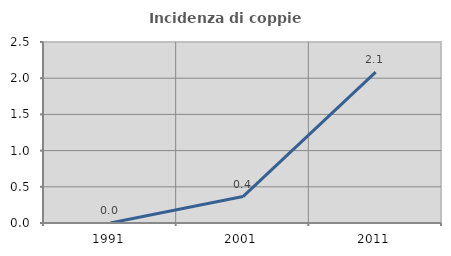
| Category | Incidenza di coppie miste |
|---|---|
| 1991.0 | 0 |
| 2001.0 | 0.365 |
| 2011.0 | 2.083 |